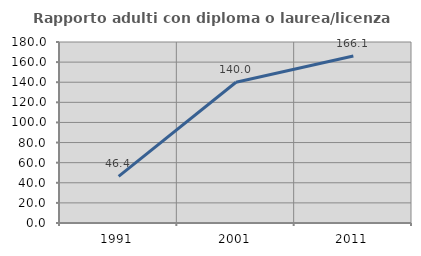
| Category | Rapporto adulti con diploma o laurea/licenza media  |
|---|---|
| 1991.0 | 46.369 |
| 2001.0 | 140 |
| 2011.0 | 166.12 |